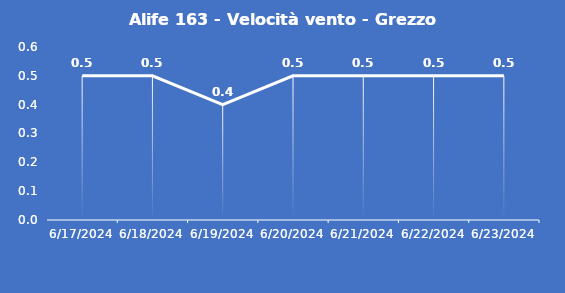
| Category | Alife 163 - Velocità vento - Grezzo (m/s) |
|---|---|
| 6/17/24 | 0.5 |
| 6/18/24 | 0.5 |
| 6/19/24 | 0.4 |
| 6/20/24 | 0.5 |
| 6/21/24 | 0.5 |
| 6/22/24 | 0.5 |
| 6/23/24 | 0.5 |